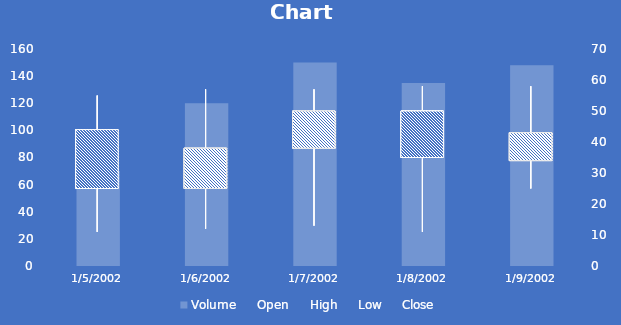
| Category | Volume |
|---|---|
| 1/5/02 | 70 |
| 1/6/02 | 120 |
| 1/7/02 | 150 |
| 1/8/02 | 135 |
| 1/9/02 | 148 |